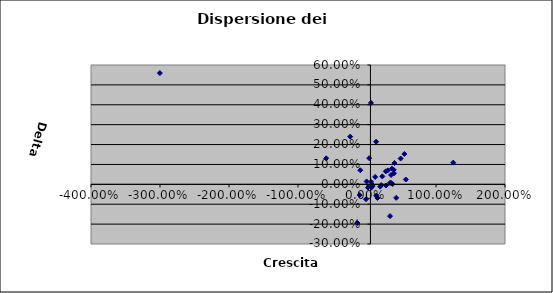
| Category | Series 0 |
|---|---|
| 0.2763281986796604 | -0.006 |
| 0.5629395063357328 | 0.024 |
| -0.2434696895022178 | 0.24 |
| 0.348149974657187 | 0.007 |
| 0.42272021975814944 | -0.068 |
| -3.002232059471777 | 0.559 |
| 0.03157778956007018 | 0.132 |
| 0.3341015577652109 | -0.16 |
| 0.05897500207926143 | 0.012 |
| 0.3019383374528424 | 0.07 |
| 0.48764983654195415 | 0.13 |
| 0.34824359708805197 | 0.047 |
| -0.1055280898876404 | -0.054 |
| 0.3979101823032458 | 0.107 |
| -0.5913530379773888 | 0.131 |
| 0.3610474980206386 | 0.079 |
| -0.005615032760539096 | 0.015 |
| 0.3710066890560382 | 0.002 |
| 0.19172942701867624 | -0.011 |
| 0.22214682294879706 | 0.04 |
| 0.27162557459256154 | 0.065 |
| 0.3331268703458834 | 0.007 |
| 0.07262876065377943 | -0.005 |
| 0.07944879210615863 | -0.003 |
| 0.13195987973287115 | 0.214 |
| 0.5415710056677594 | 0.153 |
| 0.1515826905739759 | -0.068 |
| 0.38670376865226763 | 0.073 |
| 0.11823726145976776 | 0.037 |
| 0.20620401670312183 | -0.004 |
| 0.014000410422630116 | -0.016 |
| -0.13901586447969883 | -0.194 |
| 0.13447251114413072 | -0.057 |
| 0.3913849004168597 | 0.056 |
| 1.249798599491851 | 0.109 |
| -0.014396738438017587 | -0.075 |
| -0.09757617811541486 | 0.071 |
| 0.06356109391987963 | -0.017 |
| 0.05736434108527133 | 0.409 |
| 0.07906006829759837 | -0.009 |